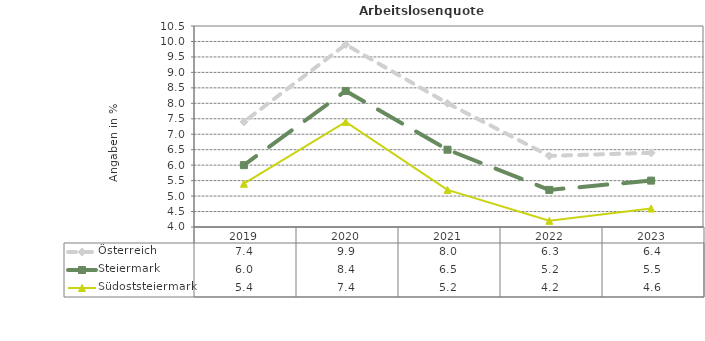
| Category | Österreich | Steiermark | Südoststeiermark |
|---|---|---|---|
| 2023.0 | 6.4 | 5.5 | 4.6 |
| 2022.0 | 6.3 | 5.2 | 4.2 |
| 2021.0 | 8 | 6.5 | 5.2 |
| 2020.0 | 9.9 | 8.4 | 7.4 |
| 2019.0 | 7.4 | 6 | 5.4 |